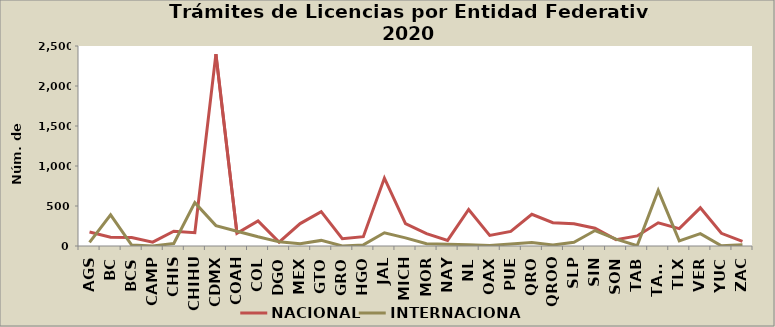
| Category | NACIONAL | INTERNACIONAL |
|---|---|---|
| AGS | 175 | 46 |
| BC | 109 | 390 |
| BCS | 105 | 12 |
| CAMP | 48 | 1 |
| CHIS | 185 | 31 |
| CHIHU | 166 | 542 |
| CDMX | 2398 | 255 |
| COAH | 158 | 185 |
| COL | 313 | 115 |
| DGO | 48 | 52 |
| MEX | 280 | 28 |
| GTO | 430 | 70 |
| GRO | 92 | 1 |
| HGO | 117 | 14 |
| JAL | 849 | 165 |
| MICH | 280 | 102 |
| MOR | 155 | 29 |
| NAY | 70 | 23 |
| NL | 456 | 17 |
| OAX | 133 | 6 |
| PUE | 183 | 26 |
| QRO | 397 | 45 |
| QROO | 292 | 12 |
| SLP | 279 | 46 |
| SIN | 222 | 193 |
| SON | 79 | 85 |
| TAB | 126 | 4 |
| TAMS | 290 | 695 |
| TLX | 217 | 64 |
| VER | 477 | 154 |
| YUC | 159 | 2 |
| ZAC | 59 | 15 |